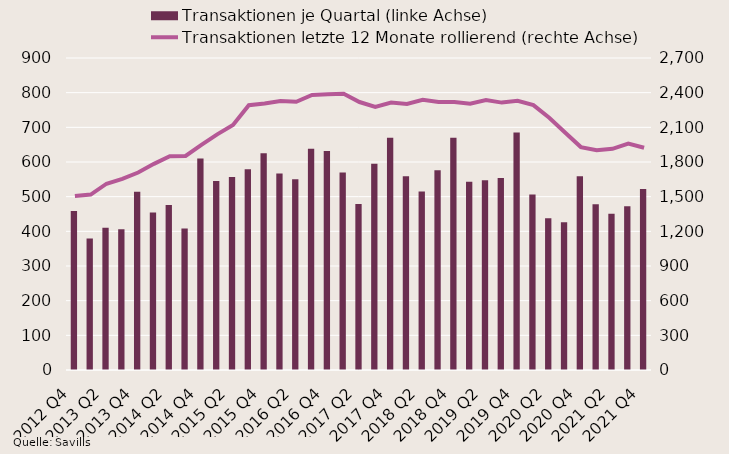
| Category | Transaktionen je Quartal (linke Achse) |
|---|---|
| 2012 Q4 | 459 |
| 2013 Q1 | 379 |
| 2013 Q2 | 410 |
| 2013 Q3 | 406 |
| 2013 Q4 | 514 |
| 2014 Q1 | 454 |
| 2014 Q2 | 476 |
| 2014 Q3 | 408 |
| 2014 Q4 | 610 |
| 2015 Q1 | 545 |
| 2015 Q2 | 557 |
| 2015 Q3 | 579 |
| 2015 Q4 | 625 |
| 2016 Q1 | 567 |
| 2016 Q2 | 550 |
| 2016 Q3 | 638 |
| 2016 Q4 | 632 |
| 2017 Q1 | 570 |
| 2017 Q2 | 479 |
| 2017 Q3 | 595 |
| 2017 Q4 | 670 |
| 2018 Q1 | 559 |
| 2018 Q2 | 515 |
| 2018 Q3 | 576 |
| 2018 Q4 | 670 |
| 2019 Q1 | 543 |
| 2019 Q2 | 547 |
| 2019 Q3 | 554 |
| 2019 Q4 | 685 |
| 2020 Q1 | 506 |
| 2020 Q2 | 438 |
| 2020 Q3 | 426 |
| 2020 Q4 | 559 |
| 2021 Q1 | 478 |
| 2021 Q2 | 451 |
| 2021 Q3 | 472 |
| 2021 Q4 | 522 |